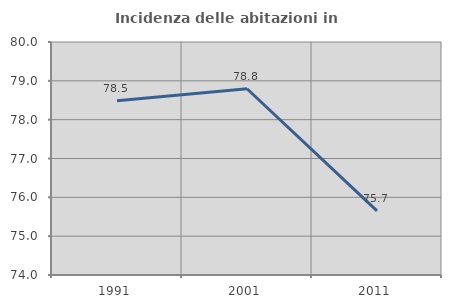
| Category | Incidenza delle abitazioni in proprietà  |
|---|---|
| 1991.0 | 78.49 |
| 2001.0 | 78.796 |
| 2011.0 | 75.653 |